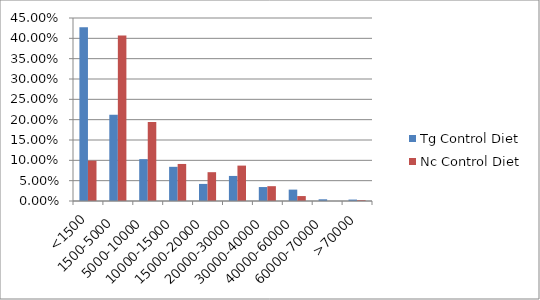
| Category | Tg Control Diet | Nc Control Diet |
|---|---|---|
| <1500 | 0.427 | 0.099 |
| 1500-5000 | 0.212 | 0.407 |
| 5000-10000 | 0.103 | 0.194 |
| 10000-15000 | 0.084 | 0.091 |
| 15000-20000 | 0.042 | 0.071 |
| 20000-30000 | 0.062 | 0.087 |
| 30000-40000 | 0.034 | 0.036 |
| 40000-60000 | 0.028 | 0.012 |
| 60000-70000 | 0.004 | 0 |
| >70000 | 0.004 | 0.002 |